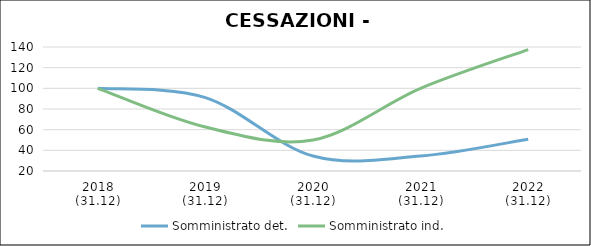
| Category | Somministrato det. | Somministrato ind. |
|---|---|---|
| 2018
(31.12) | 100 | 100 |
| 2019
(31.12) | 91.051 | 62.5 |
| 2020
(31.12) | 34.487 | 50 |
| 2021
(31.12) | 34.425 | 100 |
| 2022
(31.12) | 50.764 | 137.5 |